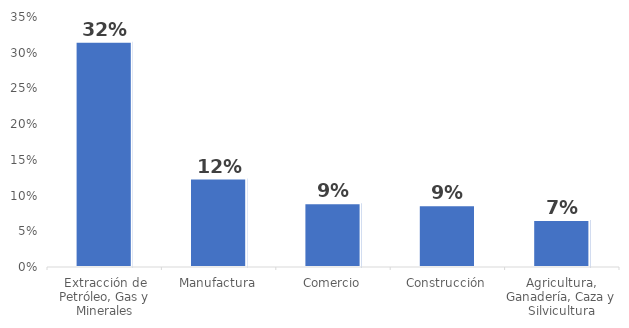
| Category | Series 0 |
|---|---|
| Extracción de Petróleo, Gas y Minerales | 0.315 |
| Manufactura | 0.124 |
| Comercio | 0.089 |
| Construcción | 0.086 |
| Agricultura, Ganadería, Caza y Silvicultura | 0.066 |